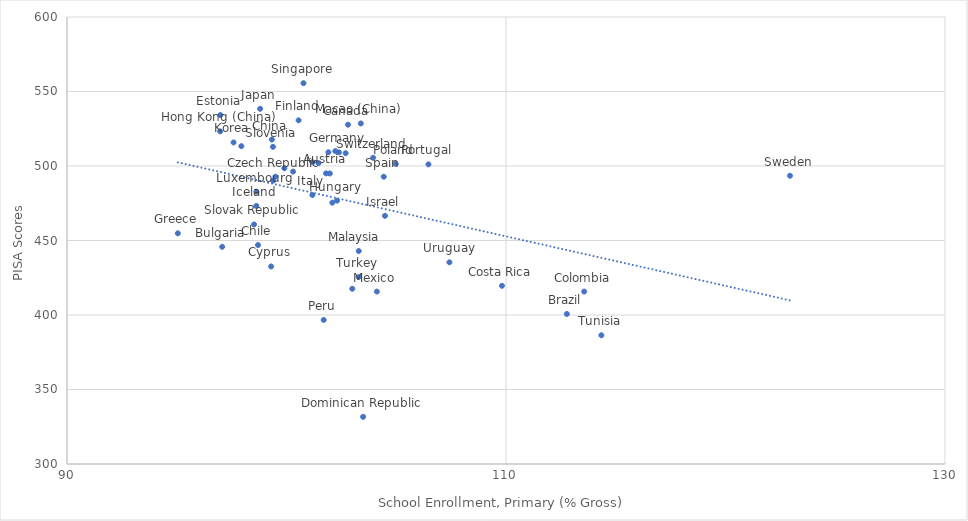
| Category | Series 0 |
|---|---|
| 102.22319 | 509.994 |
| 101.8011 | 495.037 |
| 112.77329 | 400.682 |
| 97.07002 | 445.772 |
| 102.80303 | 527.705 |
| 98.70303 | 446.956 |
| 99.33323 | 517.779 |
| 113.56272 | 415.729 |
| 109.81741 | 419.608 |
| 99.30012 | 432.577 |
| 99.49798 | 492.83 |
| 101.46172 | 501.937 |
| 103.49071 | 331.639 |
| 96.9854299999999 | 534.194 |
| 100.55111 | 530.661 |
| 101.97449 | 494.978 |
| 102.38905 | 509.141 |
| 95.0495399999999 | 454.829 |
| 96.97839 | 523.277 |
| 102.3013 | 476.748 |
| 98.6254299999999 | 473.23 |
| 101.18464 | 502.575 |
| 104.48587 | 466.553 |
| 101.1794 | 480.547 |
| 98.79994 | 538.395 |
| 97.58806 | 515.81 |
| 99.39332 | 490.225 |
| 102.08926 | 475.409 |
| 98.6271299999999 | 482.806 |
| 103.38477 | 528.55 |
| 103.29123 | 442.948 |
| 104.11754 | 415.71 |
| 102.69498 | 508.575 |
| 97.94278 | 513.304 |
| 99.90401 | 498.481 |
| 101.69511 | 396.684 |
| 104.97503 | 501.435 |
| 106.46703 | 501.1 |
| 102.99762 | 417.611 |
| 100.77321 | 555.575 |
| 98.52261 | 460.775 |
| 99.38422 | 512.864 |
| 104.43106 | 492.786 |
| 122.93879 | 493.422 |
| 103.94662 | 505.506 |
| 114.34463 | 386.403 |
| 103.28537 | 425.49 |
| 101.90924 | 509.222 |
| 100.29991 | 496.242 |
| 107.42318 | 435.363 |